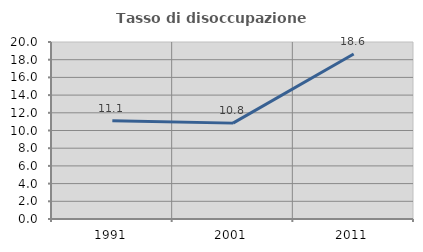
| Category | Tasso di disoccupazione giovanile  |
|---|---|
| 1991.0 | 11.111 |
| 2001.0 | 10.833 |
| 2011.0 | 18.638 |